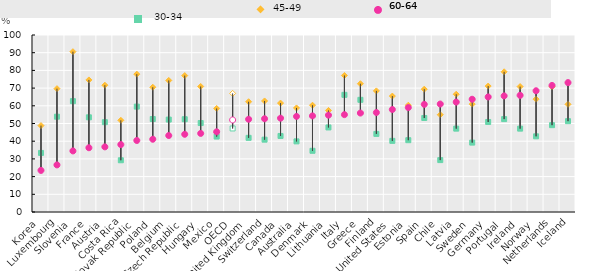
| Category | 30-34 | 45-49 | 60-64 |
|---|---|---|---|
| Korea | 33.375 | 48.824 | 23.5 |
| Luxembourg | 53.846 | 69.678 | 26.6 |
| Slovenia | 62.618 | 90.574 | 34.5 |
| France | 53.488 | 74.62 | 36.3 |
| Austria | 50.745 | 71.638 | 36.8 |
| Costa Rica | 29.233 | 51.809 | 38.1 |
| Slovak Republic | 59.544 | 77.881 | 40.4 |
| Poland | 52.529 | 70.477 | 41.1 |
| Belgium | 52.21 | 74.321 | 43.2 |
| Czech Republic | 52.413 | 77.069 | 43.9 |
| Hungary | 50.256 | 70.926 | 44.4 |
| Mexico | 42.623 | 58.508 | 45.3 |
| OECD | 47.201 | 67.02 | 52.012 |
| United Kingdom | 41.898 | 62.305 | 52.4 |
| Switzerland | 40.871 | 62.732 | 52.7 |
| Canada | 42.96 | 61.529 | 53 |
| Australia | 39.9 | 58.787 | 54 |
| Denmark | 34.585 | 60.328 | 54.3 |
| Lithuania | 47.775 | 57.376 | 54.7 |
| Italy | 66.191 | 77.139 | 55 |
| Greece | 63.38 | 72.474 | 55.9 |
| Finland | 44.122 | 68.427 | 56.2 |
| United States | 40.2 | 65.5 | 57.9 |
| Estonia | 40.567 | 60.326 | 59 |
| Spain | 53.113 | 69.39 | 60.8 |
| Chile | 29.324 | 54.953 | 61 |
| Latvia | 47.101 | 66.531 | 62.1 |
| Sweden | 39.206 | 60.96 | 63.7 |
| Germany | 50.856 | 71.148 | 65 |
| Portugal | 52.486 | 79.205 | 65.6 |
| Ireland | 47.098 | 70.847 | 65.9 |
| Norway | 42.754 | 63.755 | 68.5 |
| Netherlands | 49.059 | 70.776 | 71.5 |
| Iceland | 51.323 | 60.836 | 73.1 |